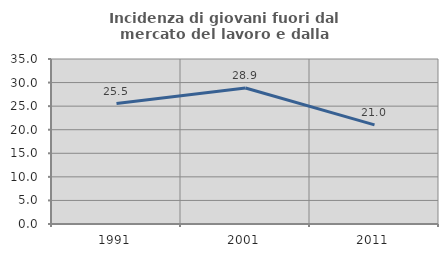
| Category | Incidenza di giovani fuori dal mercato del lavoro e dalla formazione  |
|---|---|
| 1991.0 | 25.545 |
| 2001.0 | 28.862 |
| 2011.0 | 21.026 |